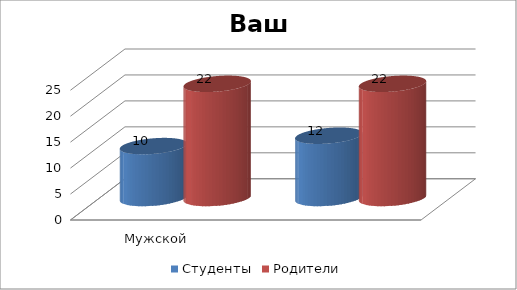
| Category | Студенты | Родители |
|---|---|---|
| Мужской | 10 | 22 |